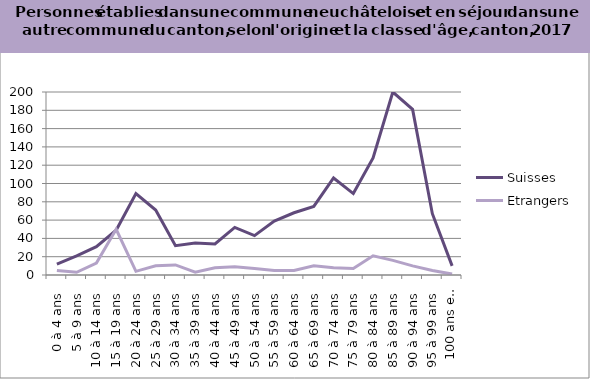
| Category | Suisses | Etrangers |
|---|---|---|
| 0 à 4 ans | 12 | 5 |
| 5 à 9 ans | 21 | 3 |
| 10 à 14 ans | 31 | 13 |
| 15 à 19 ans | 49 | 50 |
| 20 à 24 ans | 89 | 4 |
| 25 à 29 ans | 71 | 10 |
| 30 à 34 ans | 32 | 11 |
| 35 à 39 ans | 35 | 3 |
| 40 à 44 ans | 34 | 8 |
| 45 à 49 ans | 52 | 9 |
| 50 à 54 ans | 43 | 7 |
| 55 à 59 ans | 59 | 5 |
| 60 à 64 ans | 68 | 5 |
| 65 à 69 ans | 75 | 10 |
| 70 à 74 ans | 106 | 8 |
| 75 à 79 ans | 89 | 7 |
| 80 à 84 ans | 128 | 21 |
| 85 à 89 ans | 200 | 16 |
| 90 à 94 ans | 181 | 10 |
| 95 à 99 ans | 67 | 5 |
| 100 ans et plus | 10 | 1 |